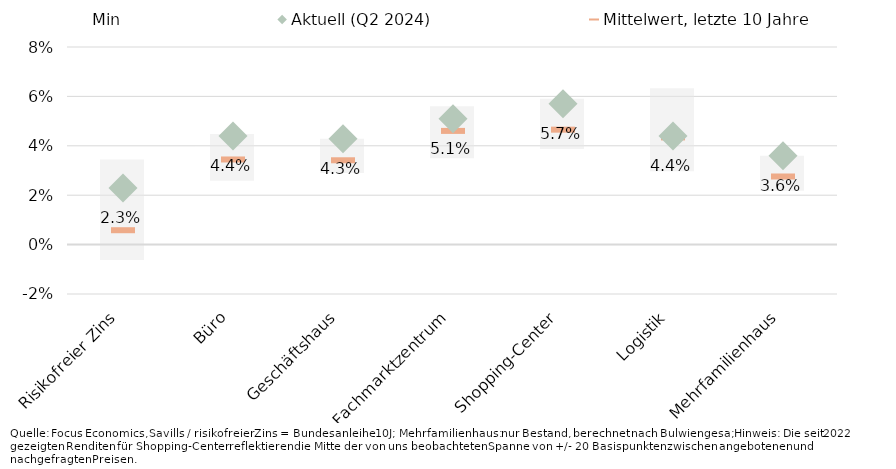
| Category | Min | Spanne Min/Max, letzte 10 Jahre |
|---|---|---|
| Risikofreier Zins | -0.006 | 0.034 |
| Büro | 0.026 | 0.019 |
| Geschäftshaus | 0.029 | 0.014 |
| Fachmarktzentrum | 0.035 | 0.021 |
| Shopping-Center | 0.039 | 0.02 |
| Logistik | 0.03 | 0.034 |
| Mehrfamilienhaus | 0.022 | 0.014 |